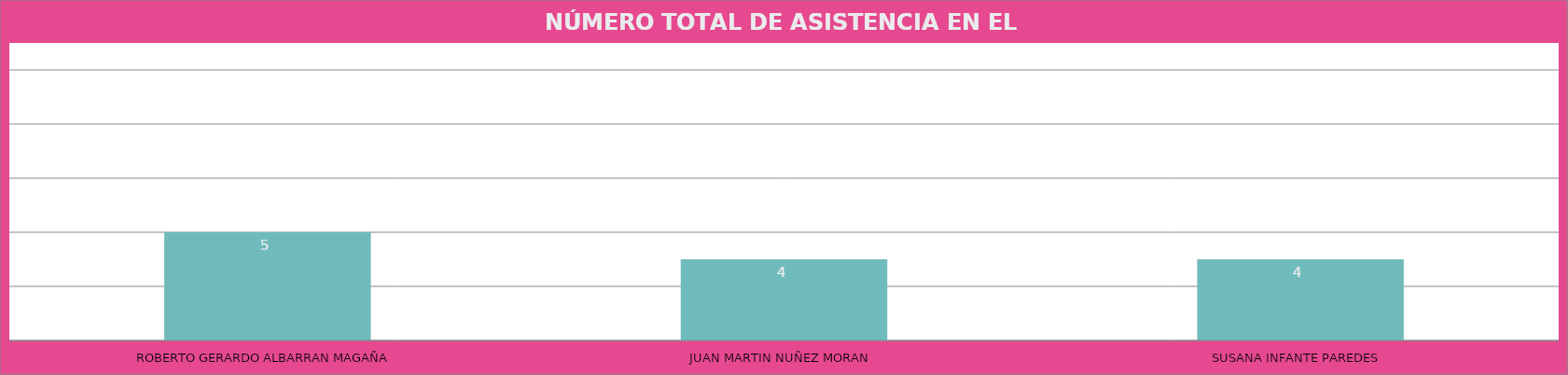
| Category | ROBERTO GERARDO ALBARRAN MAGAÑA |
|---|---|
| ROBERTO GERARDO ALBARRAN MAGAÑA | 5 |
| JUAN MARTIN NUÑEZ MORAN  | 4 |
| SUSANA INFANTE PAREDES  | 4 |